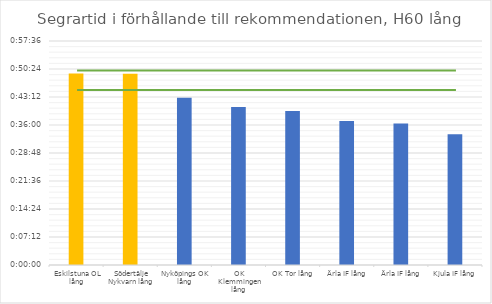
| Category | H60 tid |
|---|---|
| Eskilstuna OL lång | 0.034 |
| Södertälje Nykvarn lång | 0.034 |
| Nyköpings OK lång | 0.03 |
| OK Klemmingen lång | 0.028 |
| OK Tor lång | 0.027 |
| Ärla IF lång | 0.026 |
| Ärla IF lång | 0.025 |
| Kjula IF lång | 0.023 |